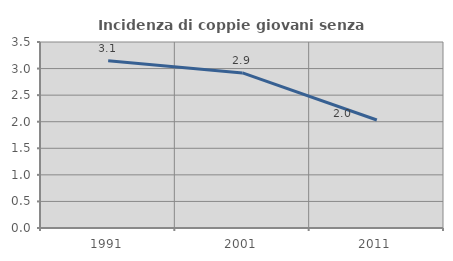
| Category | Incidenza di coppie giovani senza figli |
|---|---|
| 1991.0 | 3.146 |
| 2001.0 | 2.918 |
| 2011.0 | 2.032 |